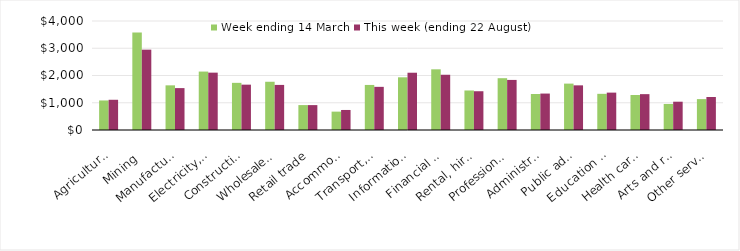
| Category | Week ending 14 March | This week (ending 22 August) |
|---|---|---|
| Agriculture, forestry and fishing | 1084.12 | 1109.15 |
| Mining | 3575.99 | 2948.31 |
| Manufacturing | 1638.88 | 1537.54 |
| Electricity, gas, water and waste services | 2144.41 | 2104.77 |
| Construction | 1730.46 | 1663.89 |
| Wholesale trade | 1770.25 | 1654.43 |
| Retail trade | 914.38 | 913.56 |
| Accommodation and food services | 674.32 | 735.19 |
| Transport, postal and warehousing | 1653.42 | 1583.53 |
| Information media and telecommunications | 1933.46 | 2101.83 |
| Financial and insurance services | 2227.01 | 2027.26 |
| Rental, hiring and real estate services | 1450.33 | 1422.6 |
| Professional, scientific and technical services | 1901.04 | 1837.85 |
| Administrative and support services | 1320.14 | 1337.34 |
| Public administration and safety | 1702.27 | 1638.45 |
| Education and training | 1327.43 | 1371.86 |
| Health care and social assistance | 1283.43 | 1315.84 |
| Arts and recreation services | 955.73 | 1038.32 |
| Other services | 1133.64 | 1210.73 |